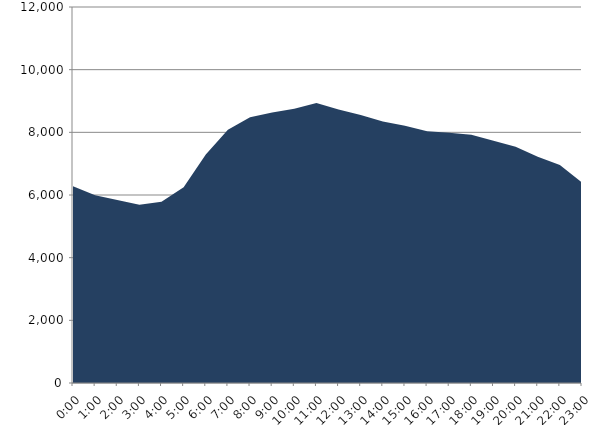
| Category | Series 0 | Series 1 |
|---|---|---|
| 2020-05-20 |  | 6276.17 |
| 2020-05-20 01:00:00 |  | 5992.62 |
| 2020-05-20 02:00:00 |  | 5843.798 |
| 2020-05-20 03:00:00 |  | 5687.073 |
| 2020-05-20 04:00:00 |  | 5788.11 |
| 2020-05-20 05:00:00 |  | 6248.617 |
| 2020-05-20 06:00:00 |  | 7295.785 |
| 2020-05-20 07:00:00 |  | 8078.961 |
| 2020-05-20 08:00:00 |  | 8485.271 |
| 2020-05-20 09:00:00 |  | 8629.937 |
| 2020-05-20 10:00:00 |  | 8754.598 |
| 2020-05-20 11:00:00 |  | 8933.16 |
| 2020-05-20 12:00:00 |  | 8728.331 |
| 2020-05-20 13:00:00 |  | 8555.586 |
| 2020-05-20 14:00:00 |  | 8343.598 |
| 2020-05-20 15:00:00 |  | 8211.479 |
| 2020-05-20 16:00:00 |  | 8038.098 |
| 2020-05-20 17:00:00 |  | 7983.556 |
| 2020-05-20 18:00:00 |  | 7926.59 |
| 2020-05-20 19:00:00 |  | 7734.786 |
| 2020-05-20 20:00:00 |  | 7543.706 |
| 2020-05-20 21:00:00 |  | 7224.524 |
| 2020-05-20 22:00:00 |  | 6958.47 |
| 2020-05-20 23:00:00 |  | 6394.329 |